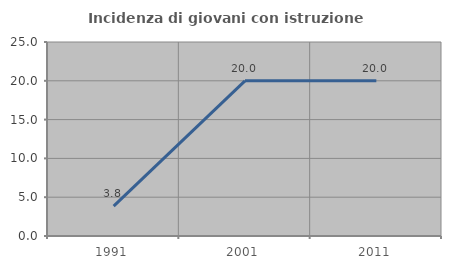
| Category | Incidenza di giovani con istruzione universitaria |
|---|---|
| 1991.0 | 3.846 |
| 2001.0 | 20 |
| 2011.0 | 20 |